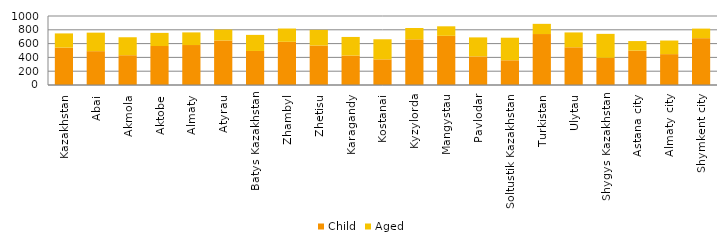
| Category | Child | Aged |
|---|---|---|
| Kazakhstan | 542.22 | 205.46 |
| Abai | 490.37 | 268.34 |
| Akmola | 431.65 | 260.36 |
| Aktobe | 565.04 | 190.39 |
| Almaty | 579.27 | 183.14 |
| Atyrau | 645.47 | 158.59 |
| Batys Kazakhstan | 493.28 | 232.99 |
| Zhambyl | 626.05 | 192.31 |
| Zhetisu | 572.26 | 226.84 |
| Karagandy | 426.72 | 269.65 |
| Kostanai | 371.43 | 291.32 |
| Kyzylorda | 662.32 | 164.17 |
| Mangystau | 712.81 | 137.82 |
| Pavlodar | 413.88 | 276.14 |
| Soltustik Kazakhstan | 358.26 | 327.13 |
| Turkistan | 738.62 | 147.6 |
| Ulytau | 546.64 | 215.32 |
| Shygys Kazakhstan | 393.73 | 347.29 |
| Astana city | 497.87 | 138.8 |
| Almaty city | 447.42 | 196.98 |
| Shymkent city | 678.64 | 138.71 |